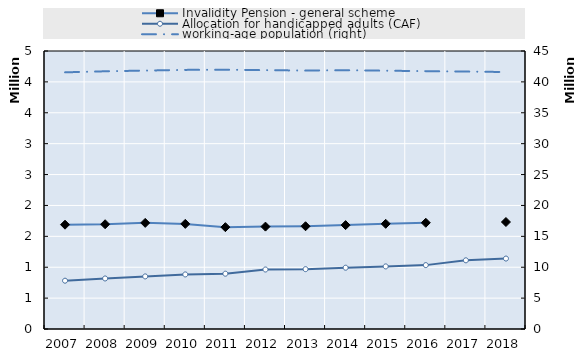
| Category | Invalidity Pension - general scheme | Allocation for handicapped adults (CAF) |
|---|---|---|
| 2007.0 | 1688329 | 781972 |
| 2008.0 | 1695841 | 817851 |
| 2009.0 | 1717846 | 851316 |
| 2010.0 | 1701442 | 883276 |
| 2011.0 | 1648751 | 895239.667 |
| 2012.0 | 1657281 | 963129 |
| 2013.0 | 1663266 | 968852 |
| 2014.0 | 1681547 | 992194.25 |
| 2015.0 | 1702582 | 1013043.5 |
| 2016.0 | 1719405 | 1034001.25 |
| 2017.0 | 0 | 1111782.5 |
| 2018.0 | 1731786 | 1140385.75 |